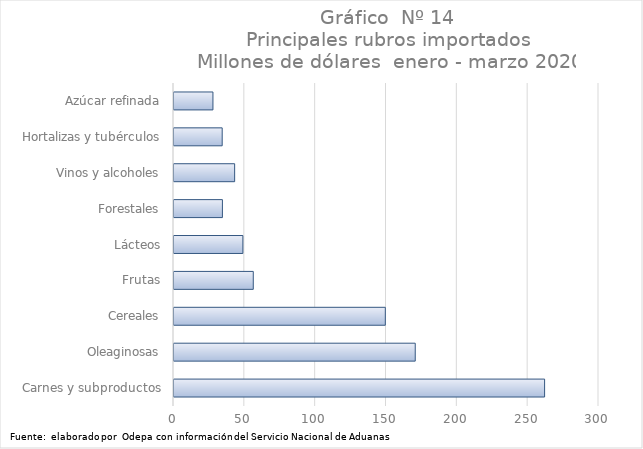
| Category | Series 0 |
|---|---|
| Carnes y subproductos | 261605.395 |
| Oleaginosas | 170284.707 |
| Cereales | 149166.876 |
| Frutas | 55962.064 |
| Lácteos | 48625.38 |
| Forestales | 34174 |
| Vinos y alcoholes | 42813.701 |
| Hortalizas y tubérculos | 34021.744 |
| Azúcar refinada | 27491.212 |